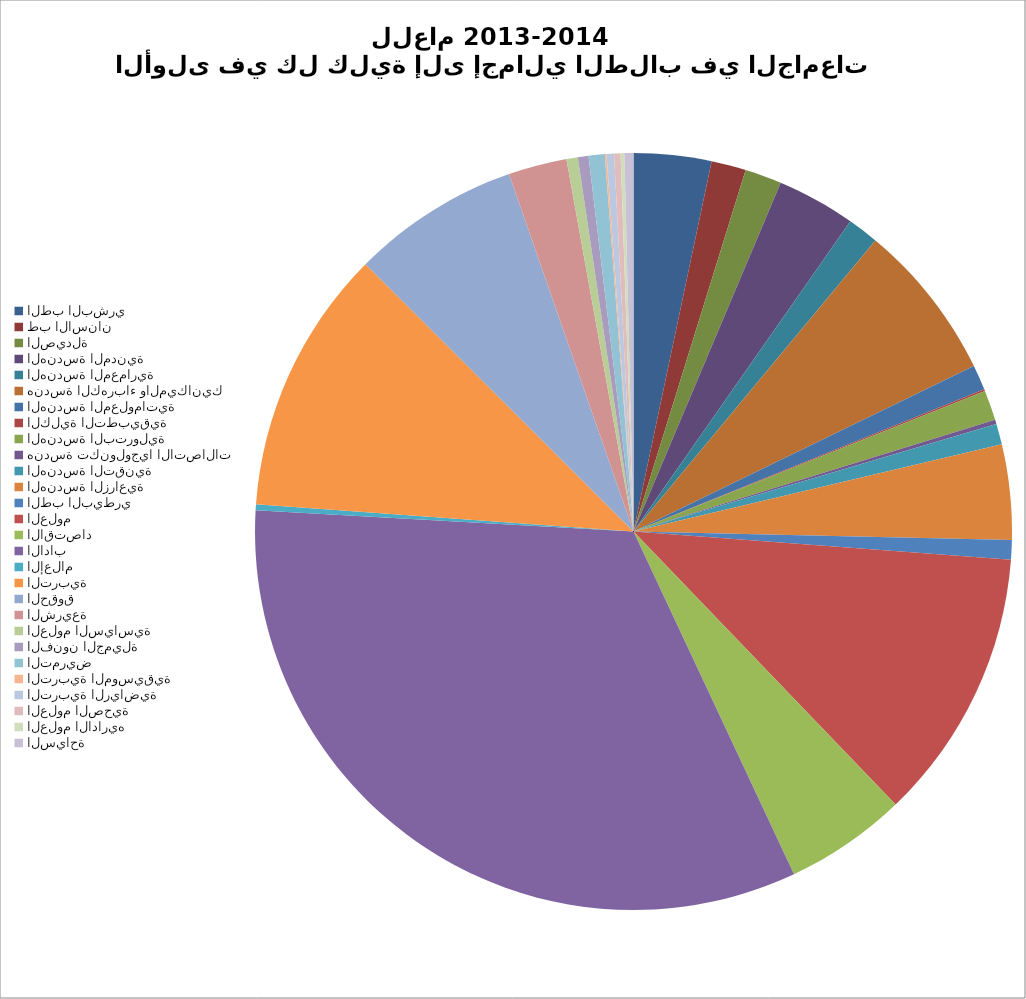
| Category | مؤشر يبين توزع الطلاب بين الذكور والاناث ويبين نسبة توزع طلاب المرحلة الجامعية الأولى في كل كلية إلى إجمالي الطلاب في الجامعات للعام 2013-2014 مجموع |
|---|---|
| الطب البشري | 15897 |
| طب الاسنان  | 7098 |
| الصيدلة | 7532 |
| الهندسة المدنية | 16107 |
| الهندسة المعمارية | 6356 |
| هندسة الكهرباء والميكانيك     | 32459 |
| الهندسة المعلوماتية  | 5160 |
| الكلية التطبيقية | 348 |
| الهندسة البترولية | 6192 |
| هندسة تكنولوجيا الاتصالات  | 868 |
| الهندسة التقنية | 4268 |
| الهندسة الزراعية  | 19459 |
| الطب البيطري | 4008 |
| العلوم | 55885 |
| الاقتصاد | 24986 |
| الاداب | 157787 |
| الإعلام | 1260 |
| التربية   | 54397 |
| الحقوق | 34507 |
| الشريعة | 11991 |
| العلوم السياسية | 2325 |
| الفنون الجميلة | 2184 |
| التمريض | 3305 |
| التربية الموسيقية | 343 |
| التربية الرياضية | 1535 |
| العلوم الصحية | 1324 |
| العلوم الاداريه | 767 |
| السياحة | 1839 |